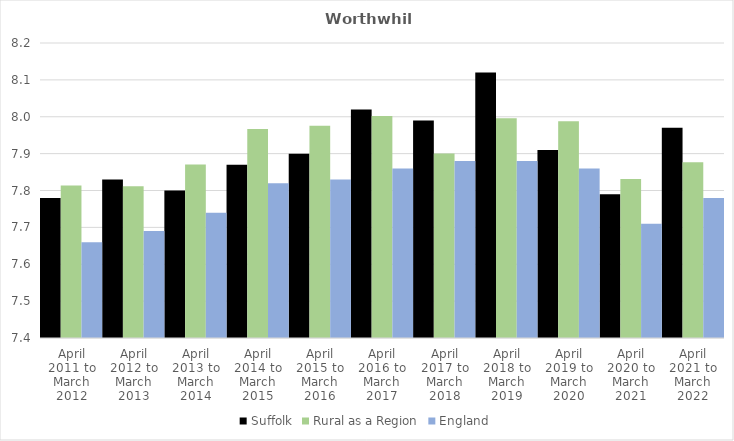
| Category | Suffolk | Rural as a Region | England |
|---|---|---|---|
| April 2011 to March 2012 | 7.78 | 7.813 | 7.66 |
| April 2012 to March 2013 | 7.83 | 7.811 | 7.69 |
| April 2013 to March 2014 | 7.8 | 7.871 | 7.74 |
| April 2014 to March 2015 | 7.87 | 7.967 | 7.82 |
| April 2015 to March 2016 | 7.9 | 7.975 | 7.83 |
| April 2016 to March 2017 | 8.02 | 8.002 | 7.86 |
| April 2017 to March 2018 | 7.99 | 7.9 | 7.88 |
| April 2018 to March 2019 | 8.12 | 7.996 | 7.88 |
| April 2019 to March 2020 | 7.91 | 7.988 | 7.86 |
| April 2020 to March 2021 | 7.79 | 7.831 | 7.71 |
| April 2021 to March 2022 | 7.97 | 7.877 | 7.78 |